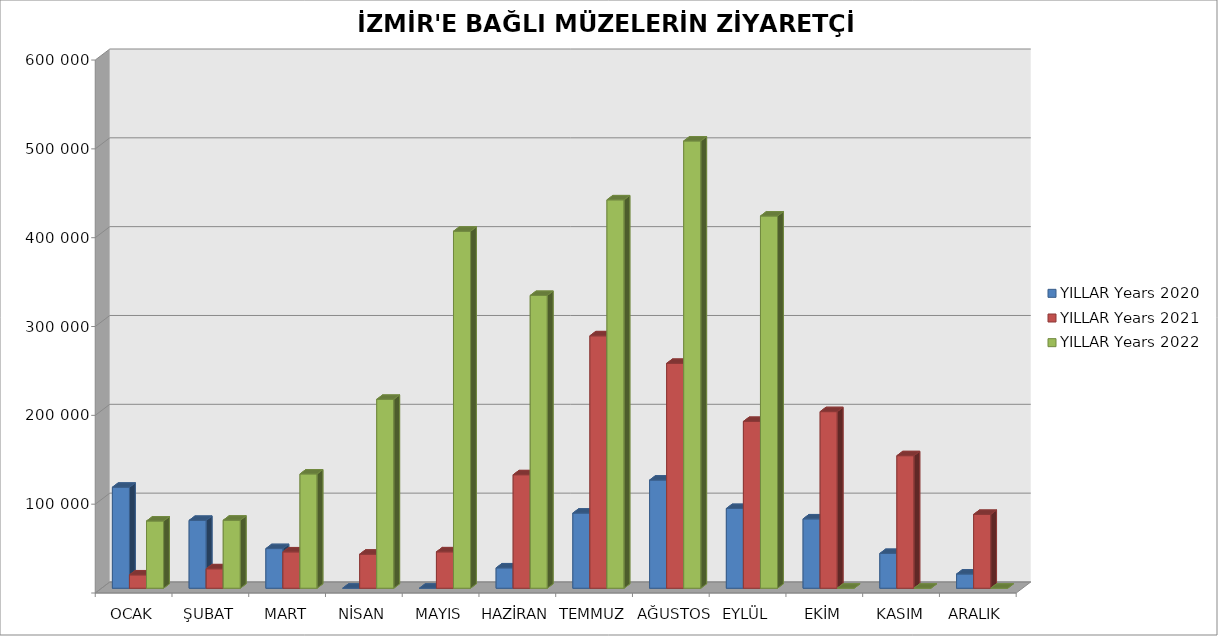
| Category | YILLAR |
|---|---|
| OCAK | 75648 |
| ŞUBAT | 76569 |
| MART | 128664 |
| NİSAN | 212657 |
| MAYIS | 401887 |
| HAZİRAN | 329617 |
| TEMMUZ | 437234 |
| AĞUSTOS | 503510 |
| EYLÜL | 419015 |
| EKİM | 0 |
| KASIM | 0 |
| ARALIK | 0 |